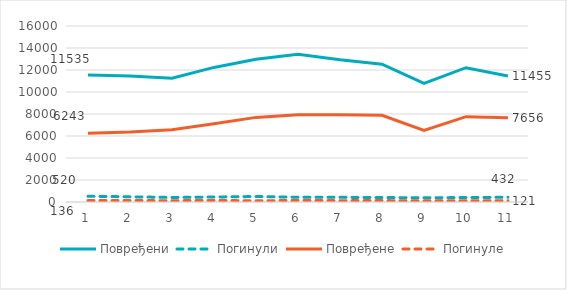
| Category | Повређени | Погинули | Повређене | Погинуле |
|---|---|---|---|---|
| 0 | 11535 | 520 | 6243 | 136 |
| 1 | 11447 | 474 | 6362 | 134 |
| 2 | 11248 | 413 | 6579 | 118 |
| 3 | 12235 | 454 | 7119 | 145 |
| 4 | 12969 | 499 | 7692 | 108 |
| 5 | 13422 | 433 | 7939 | 146 |
| 6 | 12930 | 425 | 7921 | 123 |
| 7 | 12525 | 404 | 7881 | 130 |
| 8 | 10792 | 388 | 6501 | 104 |
| 9 | 12208 | 404 | 7757 | 117 |
| 10 | 11455 | 432 | 7656 | 121 |